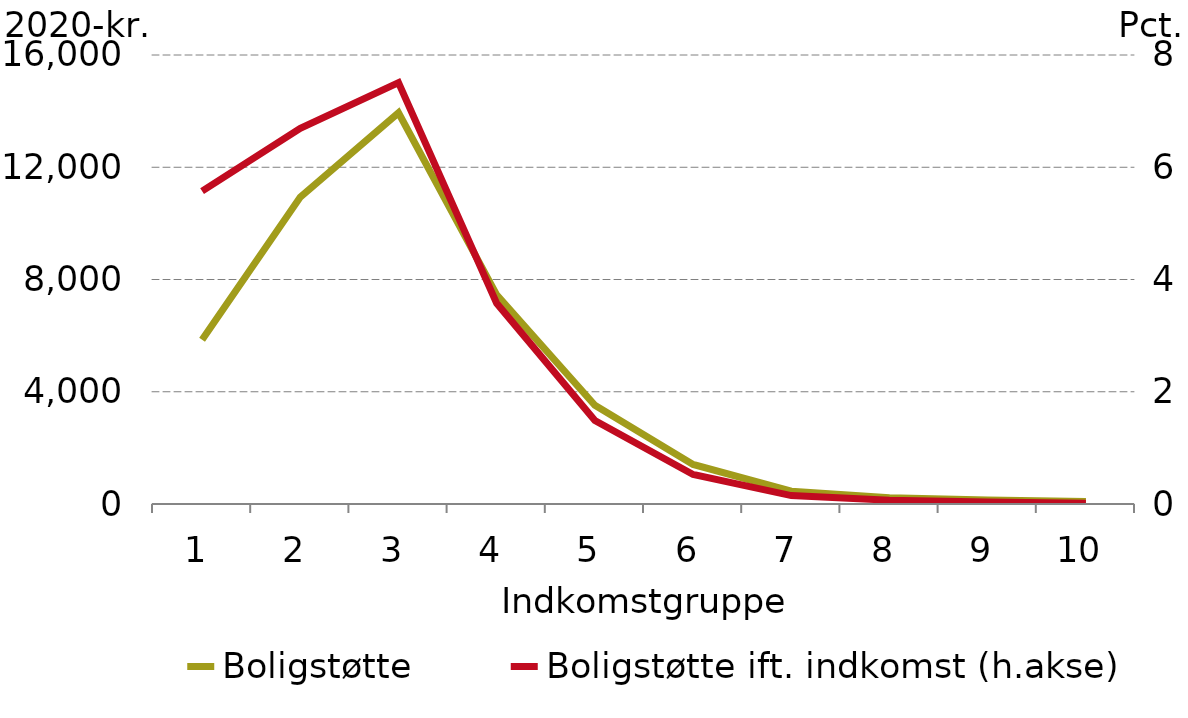
| Category |  Boligstøtte |
|---|---|
| 0 | 5850.155 |
| 1 | 10938.771 |
| 2 | 13941.84 |
| 3 | 7451.622 |
| 4 | 3519.635 |
| 5 | 1411.594 |
| 6 | 456.989 |
| 7 | 226.133 |
| 8 | 144.837 |
| 9 | 85.944 |